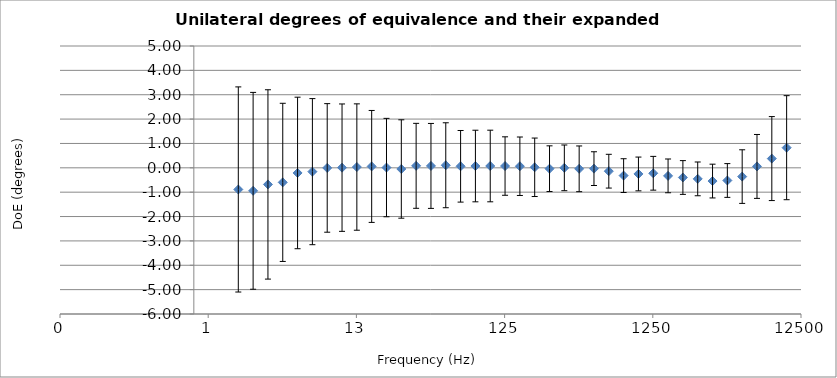
| Category | Series 0 |
|---|---|
| 1.995262314968878 | -0.888 |
| 2.5118864315095797 | -0.944 |
| 3.1622776601683764 | -0.682 |
| 3.98107170553497 | -0.597 |
| 5.011872336272721 | -0.211 |
| 6.309573444801931 | -0.157 |
| 7.943282347242812 | -0.004 |
| 9.999999999999995 | 0.007 |
| 12.589254117941676 | 0.032 |
| 15.8489319246111 | 0.057 |
| 19.9526231496888 | 0.011 |
| 25.118864315095806 | -0.048 |
| 31.62277660168378 | 0.082 |
| 39.81071705534971 | 0.078 |
| 50.11872336272723 | 0.105 |
| 63.0957344480193 | 0.063 |
| 79.43282347242814 | 0.074 |
| 100.0 | 0.075 |
| 125.8925411794167 | 0.073 |
| 158.48931924611136 | 0.065 |
| 199.52623149688793 | 0.022 |
| 251.18864315095794 | -0.036 |
| 316.22776601683796 | -0.001 |
| 398.10717055349727 | -0.041 |
| 501.18723362727224 | -0.033 |
| 630.9573444801932 | -0.138 |
| 794.3282347242815 | -0.319 |
| 1000.0 | -0.252 |
| 1258.9254117941673 | -0.224 |
| 1584.8931924611134 | -0.331 |
| 1995.2623149688798 | -0.397 |
| 2511.8864315095802 | -0.454 |
| 3162.2776601683795 | -0.544 |
| 3981.0717055349733 | -0.52 |
| 5011.872336272724 | -0.36 |
| 6309.573444801932 | 0.057 |
| 7943.282347242816 | 0.379 |
| 10000.0 | 0.826 |